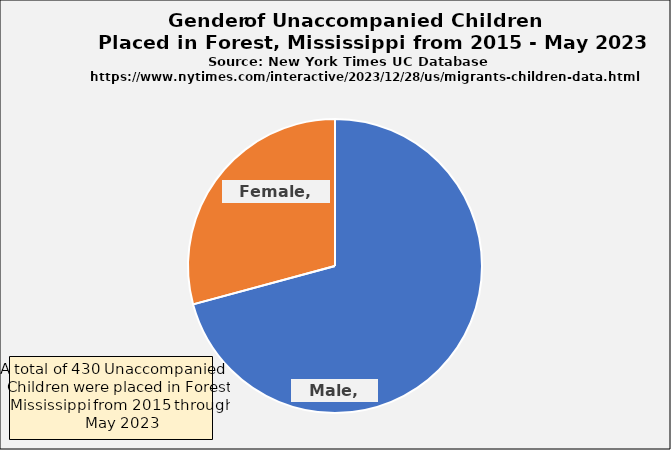
| Category | Series 0 |
|---|---|
| Male | 303 |
| Female | 125 |